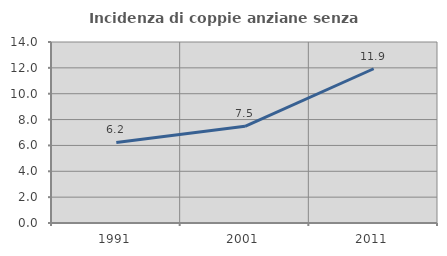
| Category | Incidenza di coppie anziane senza figli  |
|---|---|
| 1991.0 | 6.232 |
| 2001.0 | 7.479 |
| 2011.0 | 11.931 |